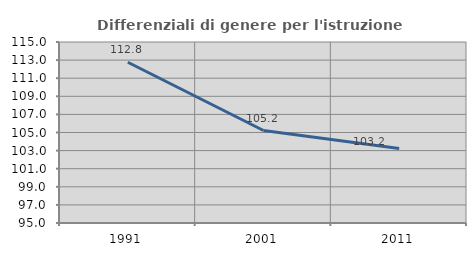
| Category | Differenziali di genere per l'istruzione superiore |
|---|---|
| 1991.0 | 112.76 |
| 2001.0 | 105.217 |
| 2011.0 | 103.22 |